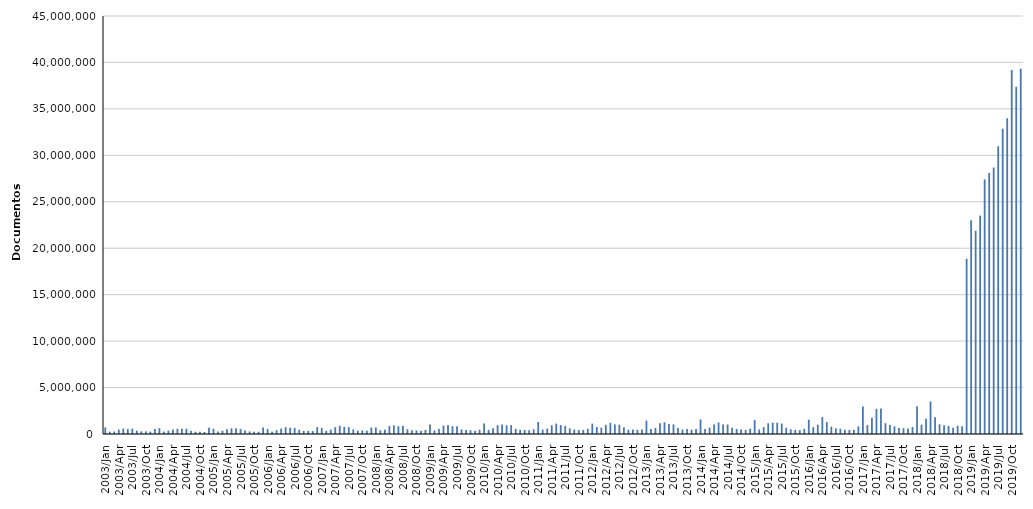
| Category | Qtd |
|---|---|
| 2003/Jan | 704604 |
| 2003/Feb | 253693 |
| 2003/Mar | 265976 |
| 2003/Apr | 479519 |
| 2003/May | 589488 |
| 2003/Jun | 536388 |
| 2003/Jul | 578796 |
| 2003/Aug | 361632 |
| 2003/Sep | 283042 |
| 2003/Oct | 282088 |
| 2003/Nov | 247698 |
| 2003/Dec | 543990 |
| 2004/Jan | 625229 |
| 2004/Feb | 262437 |
| 2004/Mar | 363949 |
| 2004/Apr | 490396 |
| 2004/May | 563400 |
| 2004/Jun | 557869 |
| 2004/Jul | 564029 |
| 2004/Aug | 362534 |
| 2004/Sep | 246124 |
| 2004/Oct | 246352 |
| 2004/Nov | 214662 |
| 2004/Dec | 671718 |
| 2005/Jan | 561305 |
| 2005/Feb | 262277 |
| 2005/Mar | 351181 |
| 2005/Apr | 508373 |
| 2005/May | 617391 |
| 2005/Jun | 613908 |
| 2005/Jul | 536550 |
| 2005/Aug | 369200 |
| 2005/Sep | 270374 |
| 2005/Oct | 252194 |
| 2005/Nov | 246164 |
| 2005/Dec | 693276 |
| 2006/Jan | 529748 |
| 2006/Feb | 258737 |
| 2006/Mar | 410552 |
| 2006/Apr | 593854 |
| 2006/May | 738586 |
| 2006/Jun | 678283 |
| 2006/Jul | 655922 |
| 2006/Aug | 458506 |
| 2006/Sep | 326605 |
| 2006/Oct | 333319 |
| 2006/Nov | 321857 |
| 2006/Dec | 737823 |
| 2007/Jan | 642112 |
| 2007/Feb | 348436 |
| 2007/Mar | 483389 |
| 2007/Apr | 731283 |
| 2007/May | 885364 |
| 2007/Jun | 771984 |
| 2007/Jul | 738997 |
| 2007/Aug | 502458 |
| 2007/Sep | 365860 |
| 2007/Oct | 388373 |
| 2007/Nov | 357463 |
| 2007/Dec | 693090 |
| 2008/Jan | 710397 |
| 2008/Feb | 398116 |
| 2008/Mar | 477968 |
| 2008/Apr | 855184 |
| 2008/May | 930364 |
| 2008/Jun | 841917 |
| 2008/Jul | 874007 |
| 2008/Aug | 502094 |
| 2008/Sep | 407575 |
| 2008/Oct | 387891 |
| 2008/Nov | 336730 |
| 2008/Dec | 436580 |
| 2009/Jan | 1020582 |
| 2009/Feb | 383840 |
| 2009/Mar | 533390 |
| 2009/Apr | 904825 |
| 2009/May | 968215 |
| 2009/Jun | 835646 |
| 2009/Jul | 844889 |
| 2009/Aug | 494249 |
| 2009/Sep | 418953 |
| 2009/Oct | 402976 |
| 2009/Nov | 359505 |
| 2009/Dec | 454207 |
| 2010/Jan | 1140104 |
| 2010/Feb | 436928 |
| 2010/Mar | 608890 |
| 2010/Apr | 941863 |
| 2010/May | 1025589 |
| 2010/Jun | 936897 |
| 2010/Jul | 952336 |
| 2010/Aug | 562212 |
| 2010/Sep | 451576 |
| 2010/Oct | 429366 |
| 2010/Nov | 416754 |
| 2010/Dec | 506989 |
| 2011/Jan | 1291281 |
| 2011/Feb | 467737 |
| 2011/Mar | 586067 |
| 2011/Apr | 943428 |
| 2011/May | 1115604 |
| 2011/Jun | 961137 |
| 2011/Jul | 875917 |
| 2011/Aug | 609787 |
| 2011/Sep | 485030 |
| 2011/Oct | 423706 |
| 2011/Nov | 441415 |
| 2011/Dec | 560571 |
| 2012/Jan | 1120500 |
| 2012/Feb | 752918 |
| 2012/Mar | 681891 |
| 2012/Apr | 978092 |
| 2012/May | 1203240 |
| 2012/Jun | 1033601 |
| 2012/Jul | 999952 |
| 2012/Aug | 721105 |
| 2012/Sep | 450246 |
| 2012/Oct | 494699 |
| 2012/Nov | 458806 |
| 2012/Dec | 474292 |
| 2013/Jan | 1443150 |
| 2013/Feb | 526339 |
| 2013/Mar | 661507 |
| 2013/Apr | 1167633 |
| 2013/May | 1262892 |
| 2013/Jun | 1082203 |
| 2013/Jul | 1036729 |
| 2013/Aug | 646740 |
| 2013/Sep | 479646 |
| 2013/Oct | 525887 |
| 2013/Nov | 467837 |
| 2013/Dec | 526466 |
| 2014/Jan | 1571526 |
| 2014/Feb | 525156 |
| 2014/Mar | 685309 |
| 2014/Apr | 1018924 |
| 2014/May | 1237146 |
| 2014/Jun | 1017703 |
| 2014/Jul | 1025415 |
| 2014/Aug | 670401 |
| 2014/Sep | 538258 |
| 2014/Oct | 496392 |
| 2014/Nov | 444397 |
| 2014/Dec | 569951 |
| 2015/Jan | 1521870 |
| 2015/Feb | 492392 |
| 2015/Mar | 737853 |
| 2015/Apr | 1150690 |
| 2015/May | 1216852 |
| 2015/Jun | 1215464 |
| 2015/Jul | 1125855 |
| 2015/Aug | 667326 |
| 2015/Sep | 501713 |
| 2015/Oct | 446185 |
| 2015/Nov | 422599 |
| 2015/Dec | 561911 |
| 2016/Jan | 1539127 |
| 2016/Feb | 732268 |
| 2016/Mar | 994771 |
| 2016/Apr | 1821361 |
| 2016/May | 1281107 |
| 2016/Jun | 788124 |
| 2016/Jul | 614983 |
| 2016/Aug | 573154 |
| 2016/Sep | 455886 |
| 2016/Oct | 443899 |
| 2016/Nov | 461047 |
| 2016/Dec | 825409 |
| 2017/Jan | 2952688 |
| 2017/Feb | 963025 |
| 2017/Mar | 1750715 |
| 2017/Apr | 2707649 |
| 2017/May | 2742077 |
| 2017/Jun | 1159618 |
| 2017/Jul | 958981 |
| 2017/Aug | 822369 |
| 2017/Sep | 653555 |
| 2017/Oct | 622108 |
| 2017/Nov | 604439 |
| 2017/Dec | 757064 |
| 2018/Jan | 2999878 |
| 2018/Feb | 1005624 |
| 2018/Mar | 1644958 |
| 2018/Apr | 3499793 |
| 2018/May | 1816342 |
| 2018/Jun | 1045052 |
| 2018/Jul | 933766 |
| 2018/Aug | 862571 |
| 2018/Sep | 672574 |
| 2018/Oct | 885182 |
| 2018/Nov | 832082 |
| 2018/Dec | 18864678 |
| 2019/Jan | 23010122 |
| 2019/Feb | 21878708 |
| 2019/Mar | 23519269 |
| 2019/Apr | 27406500 |
| 2019/May | 28094610 |
| 2019/Jun | 28679978 |
| 2019/Jul | 30984363 |
| 2019/Aug | 32851070 |
| 2019/Sep | 34004226 |
| 2019/Oct | 39197814 |
| 2019/Nov | 37393649 |
| 2019/Dec | 39320549 |